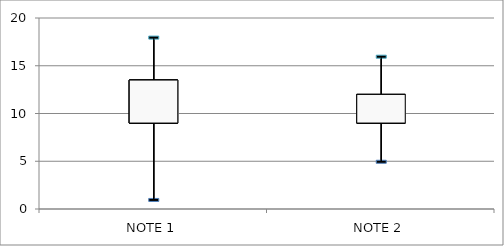
| Category | Q1 | Min | Médiane | Max | Q3 |
|---|---|---|---|---|---|
| NOTE 1 | 9 | 1 | 11 | 18 | 13.5 |
| NOTE 2 | 9 | 5 | 10.5 | 16 | 12 |